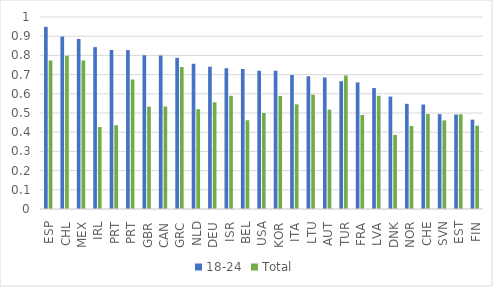
| Category | 18-24 | Total |
|---|---|---|
| ESP | 0.949 | 0.774 |
| CHL | 0.899 | 0.798 |
| MEX | 0.886 | 0.774 |
| IRL | 0.843 | 0.427 |
| PRT | 0.828 | 0.436 |
| PRT | 0.828 | 0.675 |
| GBR | 0.801 | 0.534 |
| CAN | 0.799 | 0.534 |
| GRC | 0.788 | 0.74 |
| NLD | 0.757 | 0.52 |
| DEU | 0.741 | 0.556 |
| ISR | 0.733 | 0.59 |
| BEL | 0.729 | 0.462 |
| USA | 0.72 | 0.5 |
| KOR | 0.72 | 0.589 |
| ITA | 0.698 | 0.545 |
| LTU | 0.691 | 0.595 |
| AUT | 0.685 | 0.517 |
| TUR | 0.666 | 0.696 |
| FRA | 0.659 | 0.49 |
| LVA | 0.63 | 0.59 |
| DNK | 0.585 | 0.386 |
| NOR | 0.548 | 0.433 |
| CHE | 0.544 | 0.495 |
| SVN | 0.494 | 0.462 |
| EST | 0.492 | 0.493 |
| FIN | 0.465 | 0.434 |